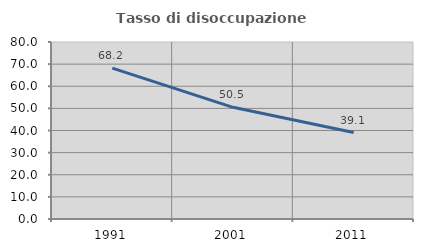
| Category | Tasso di disoccupazione giovanile  |
|---|---|
| 1991.0 | 68.203 |
| 2001.0 | 50.476 |
| 2011.0 | 39.062 |